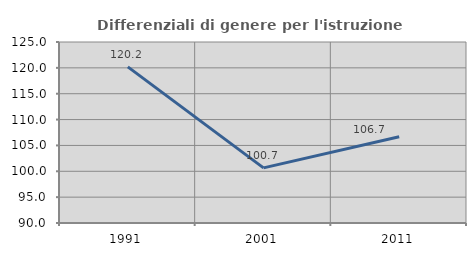
| Category | Differenziali di genere per l'istruzione superiore |
|---|---|
| 1991.0 | 120.182 |
| 2001.0 | 100.653 |
| 2011.0 | 106.682 |